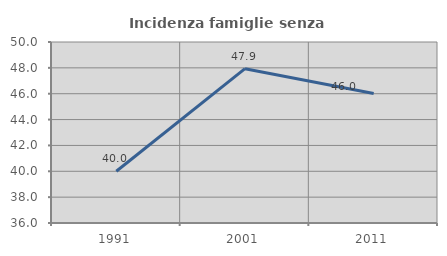
| Category | Incidenza famiglie senza nuclei |
|---|---|
| 1991.0 | 40 |
| 2001.0 | 47.938 |
| 2011.0 | 46.009 |